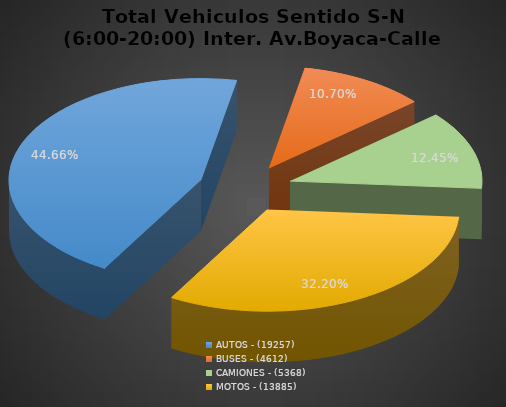
| Category | PORCENTAJE |
|---|---|
| AUTOS - (19257) | 44.657 |
| BUSES - (4612) | 10.695 |
| CAMIONES - (5368) | 12.448 |
| MOTOS - (13885) | 32.199 |